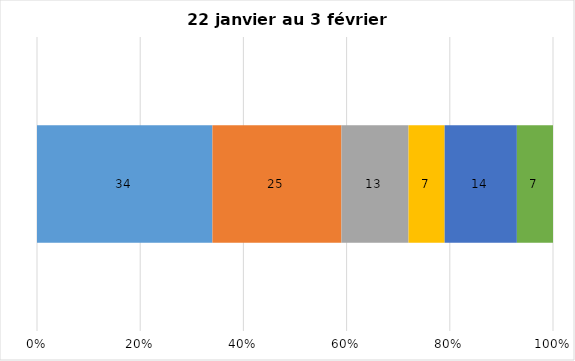
| Category | Plusieurs fois par jour | Une fois par jour | Quelques fois par semaine   | Une fois par semaine ou moins   |  Jamais   |  Je n’utilise pas les médias sociaux |
|---|---|---|---|---|---|---|
| 0 | 34 | 25 | 13 | 7 | 14 | 7 |